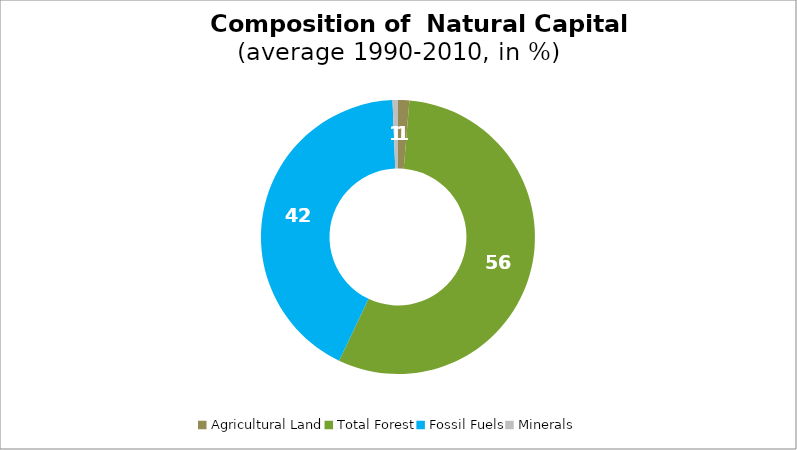
| Category | Series 0 |
|---|---|
| Agricultural Land | 1.332 |
| Total Forest | 55.738 |
| Fossil Fuels | 42.29 |
| Minerals | 0.639 |